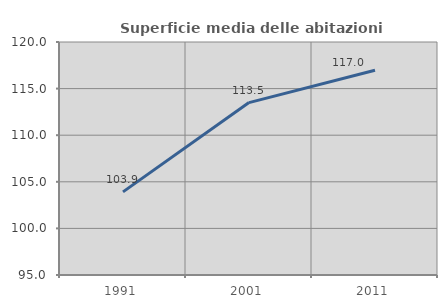
| Category | Superficie media delle abitazioni occupate |
|---|---|
| 1991.0 | 103.921 |
| 2001.0 | 113.5 |
| 2011.0 | 116.974 |